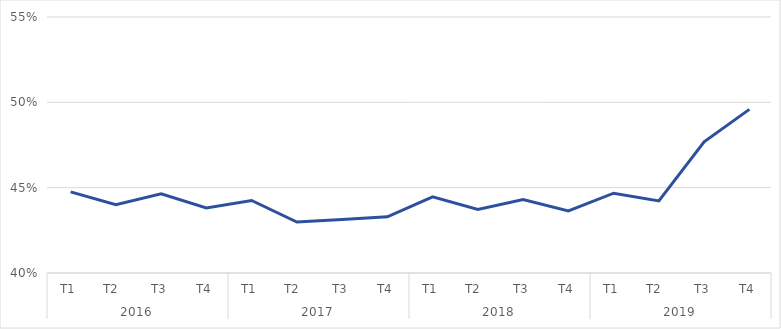
| Category | Part des VIF au sein des CBV |
|---|---|
| 0 | 0.448 |
| 1 | 0.44 |
| 2 | 0.446 |
| 3 | 0.438 |
| 4 | 0.442 |
| 5 | 0.43 |
| 6 | 0.431 |
| 7 | 0.433 |
| 8 | 0.445 |
| 9 | 0.437 |
| 10 | 0.443 |
| 11 | 0.436 |
| 12 | 0.447 |
| 13 | 0.442 |
| 14 | 0.477 |
| 15 | 0.496 |